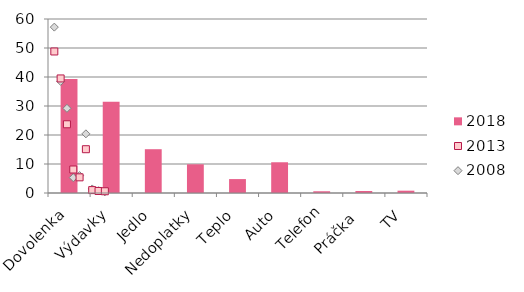
| Category | 2018 |
|---|---|
| Dovolenka  | 39.3 |
| Výdavky | 31.5 |
| Jedlo | 15.1 |
| Nedoplatky | 9.9 |
| Teplo | 4.8 |
| Auto | 10.6 |
| Telefon | 0.6 |
| Práčka  | 0.7 |
| TV | 0.8 |